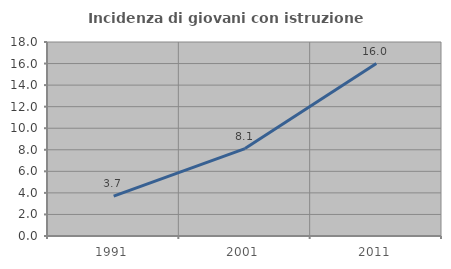
| Category | Incidenza di giovani con istruzione universitaria |
|---|---|
| 1991.0 | 3.704 |
| 2001.0 | 8.108 |
| 2011.0 | 16 |